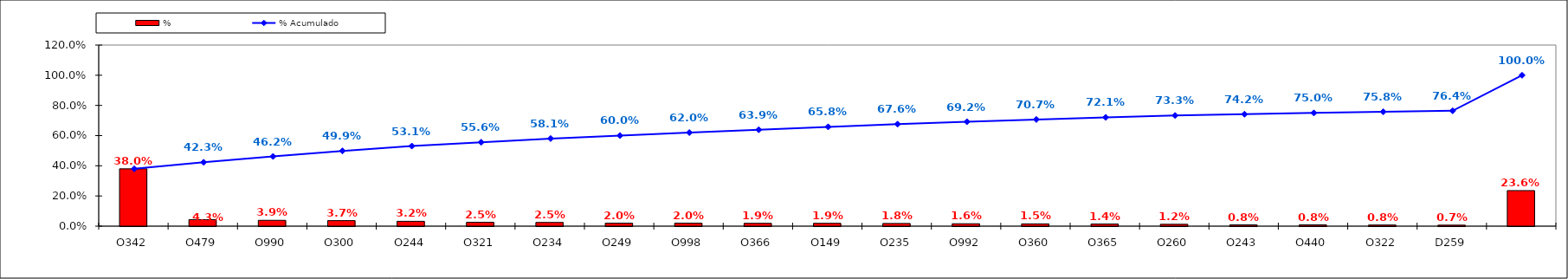
| Category | % |
|---|---|
| O342 | 0.38 |
| O479 | 0.043 |
| O990 | 0.039 |
| O300 | 0.037 |
| O244 | 0.032 |
| O321 | 0.025 |
| O234 | 0.025 |
| O249 | 0.02 |
| O998 | 0.02 |
| O366 | 0.019 |
| O149 | 0.019 |
| O235 | 0.018 |
| O992 | 0.016 |
| O360 | 0.015 |
| O365 | 0.014 |
| O260 | 0.012 |
| O243 | 0.008 |
| O440 | 0.008 |
| O322 | 0.008 |
| D259 | 0.007 |